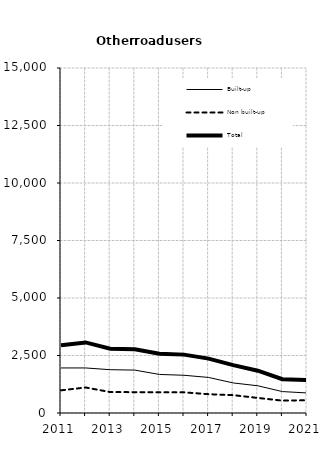
| Category | Built-up | Non built-up | Total |
|---|---|---|---|
| 2011.0 | 1958 | 985 | 2943 |
| 2012.0 | 1959 | 1109 | 3068 |
| 2013.0 | 1883 | 911 | 2794 |
| 2014.0 | 1865 | 906 | 2771 |
| 2015.0 | 1676 | 898 | 2574 |
| 2016.0 | 1640 | 898 | 2538 |
| 2017.0 | 1546 | 817 | 2363 |
| 2018.0 | 1307 | 776 | 2083 |
| 2019.0 | 1184 | 655 | 1839 |
| 2020.0 | 931 | 537 | 1468 |
| 2021.0 | 872 | 556 | 1428 |